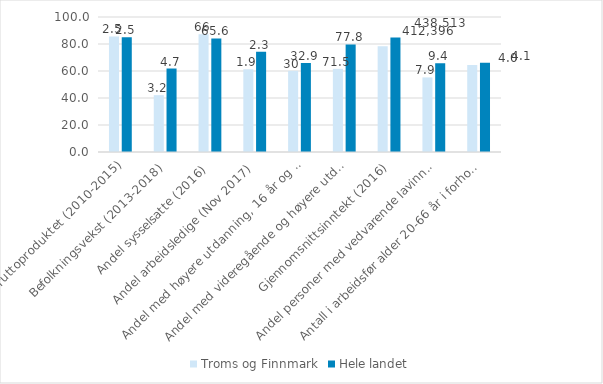
| Category | Troms og Finnmark | Hele landet |
|---|---|---|
| Endring i bruttoproduktet (2010-2015) | 85.621 | 85.077 |
| Befolkningsvekst (2013-2018) | 42.105 | 61.842 |
| Andel sysselsatte (2016) | 87.302 | 84.127 |
| Andel arbeidsledige (Nov 2017) | 61.29 | 74.194 |
| Andel med høyere utdanning, 16 år og over (2016) | 60.12 | 65.932 |
| Andel med videregående og høyere utdanning, 25-29 år (2016) | 61.605 | 79.656 |
| Gjennomsnittsinntekt (2016) | 78.256 | 84.798 |
| Andel personer med vedvarende lavinntekt (2014-16) | 55.245 | 65.734 |
| Antall i arbeidsfør alder 20-66 år i forhold til eldre 67 år og over (2018) | 64.516 | 66.129 |